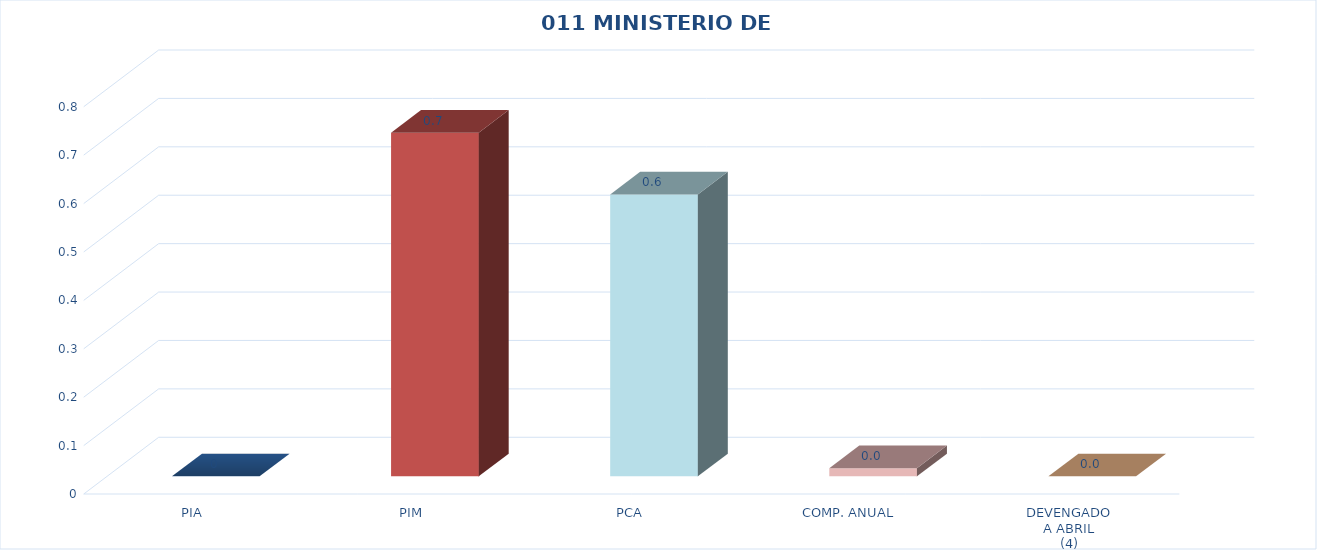
| Category | 011 MINISTERIO DE SALUD |
|---|---|
| PIA | 0 |
| PIM | 0.71 |
| PCA | 0.582 |
| COMP. ANUAL | 0.017 |
| DEVENGADO
A ABRIL
(4) | 0 |